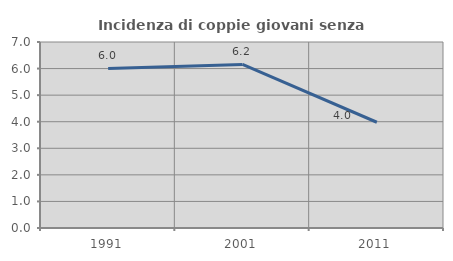
| Category | Incidenza di coppie giovani senza figli |
|---|---|
| 1991.0 | 6.003 |
| 2001.0 | 6.154 |
| 2011.0 | 3.98 |